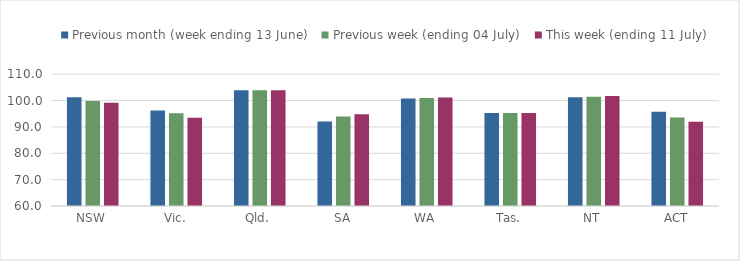
| Category | Previous month (week ending 13 June) | Previous week (ending 04 July) | This week (ending 11 July) |
|---|---|---|---|
| NSW | 101.278 | 99.847 | 99.122 |
| Vic. | 96.264 | 95.205 | 93.518 |
| Qld. | 103.948 | 103.948 | 103.948 |
| SA | 92.082 | 93.956 | 94.786 |
| WA | 100.813 | 101.012 | 101.136 |
| Tas. | 95.309 | 95.309 | 95.309 |
| NT | 101.221 | 101.399 | 101.762 |
| ACT | 95.774 | 93.526 | 91.93 |